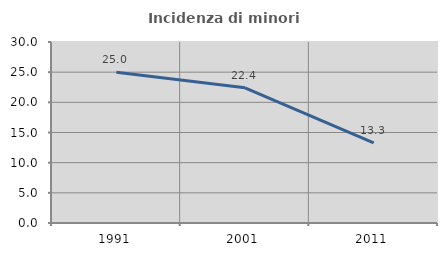
| Category | Incidenza di minori stranieri |
|---|---|
| 1991.0 | 25 |
| 2001.0 | 22.414 |
| 2011.0 | 13.287 |